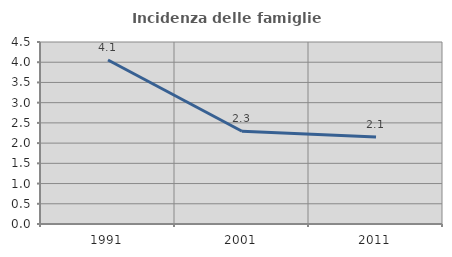
| Category | Incidenza delle famiglie numerose |
|---|---|
| 1991.0 | 4.056 |
| 2001.0 | 2.293 |
| 2011.0 | 2.15 |